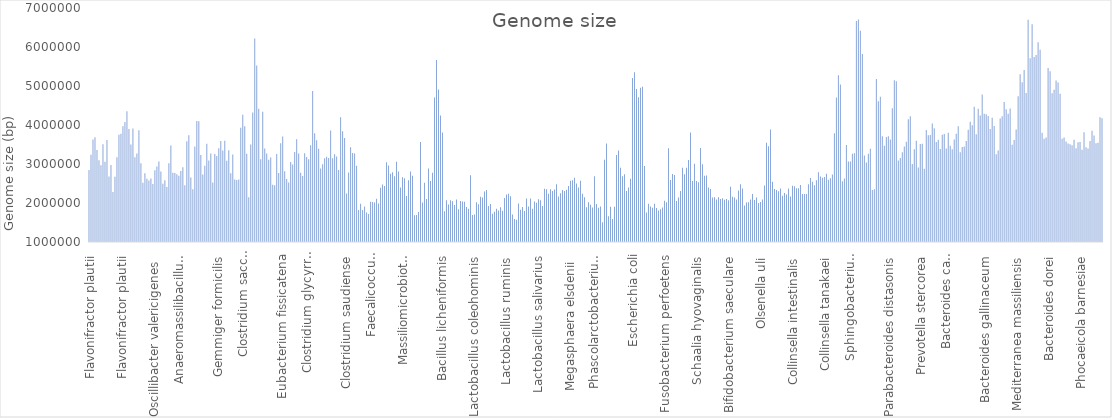
| Category | Series 0 |
|---|---|
| Flavonifractor plautii | 2845789 |
| Flavonifractor plautii | 3239670 |
| Flavonifractor plautii | 3629120 |
| Flavonifractor plautii | 3683590 |
| Flavonifractor plautii | 3357728 |
| Flavonifractor plautii  | 3098980 |
| Flavonifractor plautii | 2967986 |
| Pseudoflavonifractor phocaeensis | 3503425 |
| Flavonifractor plautii | 3054748 |
| Pseudoflavonifractor capillosus | 3617258 |
| Pseudoflavonifractor phocaeensis | 2678620 |
| Pseudoflavonifractor phocaeensis | 2973216 |
| Pseudoflavonifractor phocaeensis | 2283035 |
| Pseudoflavonifractor phocaeensis  | 2671950 |
| Flavonifractor plautii | 3170217 |
| Flavonifractor plautii  | 3751524 |
| Flavonifractor plautii | 3776725 |
| Flavonifractor plautii | 3967264 |
| Pseudoflavonifractor phocaeensis  | 4079298 |
| Pseudoflavonifractor phocaeensis | 4349976 |
| Intestinimonas butyriciproducens | 3896645 |
| Flavonifractor plautii | 3498453 |
| Flavonifractor plautii | 3907586 |
| Pseudoflavonifractor phocaeensis | 3173634 |
| Pseudoflavonifractor phocaeensis | 3272401 |
| Flavonifractor plautii | 3867419 |
| Pseudoflavonifractor capillosus | 3018026 |
| Pseudoflavonifractor capillosus | 2519586 |
| Pseudoflavonifractor capillosus | 2764660 |
| Pseudoflavonifractor capillosus | 2623188 |
| Pseudoflavonifractor capillosus | 2574287 |
| Pseudoflavonifractor capillosus  | 2627565 |
| Oscillibacter valericigenes  | 2487084 |
| Oscillibacter valericigenes | 2841521 |
| Oscillibacter valericigenes | 2936113 |
| Oscillibacter ruminantium | 3063487 |
| Oscillibacter valericigenes  | 2807727 |
| Oscillibacter valericigenes | 2493680 |
| Intestinimonas butyriciproducens | 2584430 |
| Butyricicoccus pullicaecorum | 2408243 |
| Butyricicoccus pullicaecorum | 3016034 |
| Butyricicoccus pullicaecorum | 3474625 |
| Agathobaculum desmolans | 2773809 |
| Agathobaculum desmolans | 2771997 |
| Butyricicoccus pullicaecorum | 2738173 |
| Butyricicoccus pullicaecorum | 2697586 |
| Anaeromassilibacillus senegalensis | 2820032 |
| Neglecta timonensis | 2916119 |
| Anaeromassilibacillus senegalensis  | 2453749 |
| Anaeromassilibacillus senegalensis | 3582839 |
| Anaeromassilibacillus senegalensis | 3738663 |
| Phocea massiliensis | 2650686 |
| Hydrogenoanaerobacterium saccharovorans | 2349402 |
| Anaerotruncus colihominis | 3446606 |
| Anaerotruncus colihominis | 4104028 |
| Anaerotruncus colihominis | 4098164 |
| Anaerofilum agile | 3232216 |
| Faecalibacterium prausnitzii | 2728163 |
| Faecalibacterium prausnitzii | 2956350 |
| Faecalibacterium prausnitzii | 3520066 |
| Faecalibacterium prausnitzii | 3092450 |
| Faecalibacterium prausnitzii | 3272200 |
| Fournierella massiliensis | 2528274 |
| Gemmiger formicilis | 3259334 |
| Gemmiger formicilis | 3203791 |
| Gemmiger formicilis | 3406814 |
| Gorbachella massiliensis | 3586714 |
| Fournierella massiliensis | 3347135 |
| Gemmiger formicilis | 3597344 |
| Gemmiger formicilis | 3080663 |
| Gemmiger formicilis | 3355244 |
| Clostridium lactatifermentans | 2765027 |
| Clostridium lactatifermentans | 3241294 |
| Anaerotignum lactatifermentans | 2605006 |
| Anaerotignum lactatifermentans | 2591845 |
| Anaerotignum lactatifermentans | 2599663 |
| Eubacterium hallii | 3929296 |
| Eubacterium hallii | 4260545 |
| Blautia schinkii | 3969115 |
| Clostridium saccharolyticum | 3261385 |
| Clostridium saccharolyticum  | 2149297 |
| Clostridium saccharolyticum | 3501825 |
| Clostridium saccharolyticum | 4319160 |
| Clostridium aldenense | 6217358 |
| Clostridium clostridioforme | 5528407 |
| Clostridium bolteae | 4415165 |
| Roseburia hominis | 3121960 |
| Blautia producta | 4340741 |
| Clostridium saccharolyticum | 3396328 |
| Clostridium saccharolyticum | 3268479 |
| Blautia producta  | 3110659 |
| Ruminococcus gnavus | 3169709 |
| Eubacterium contortum | 2469525 |
| Eubacterium contortum  | 2453398 |
| Eubacterium contortum | 3256976 |
| Eubacterium contortum | 2766308 |
| Eubacterium fissicatena | 3529099 |
| Eubacterium fissicatena | 3702317 |
| Mordavella massiliensis | 2813570 |
| Mordavella massiliensis | 2614310 |
| Mordavella massiliensis | 2522524 |
| Drancourtella massiliensis | 3049918 |
| Drancourtella massiliensis | 2986142 |
| Drancourtella massiliensis | 3307621 |
| Drancourtella massiliensis | 3637323 |
| Drancourtella massiliensis  | 3268163 |
| Clostridium oroticum | 2778317 |
| Lachnoclostridium phocaeense | 2689208 |
| Eubacterium contortum | 3274758 |
| Faecalicatena contorta | 3177825 |
| Faecalicatena fissicatena | 3120786 |
| Eubacterium contortum | 3480620 |
| Clostridium glycyrrhizinilyticum | 4874615 |
| Mediterraneibacter massiliensis | 3787014 |
| Clostridium glycyrrhizinilyticum  | 3611738 |
| Clostridium glycyrrhizinilyticum | 3392322 |
| Faecalicatena orotica | 2881418 |
| Ruminococcus torques | 2991956 |
| Clostridium glycyrrhizinilyticum | 3146015 |
| Clostridium glycyrrhizinilyticum | 3184216 |
| Clostridium glycyrrhizinilyticum | 3150868 |
| Clostridium glycyrrhizinilyticum | 3861943 |
| Clostridium glycyrrhizinilyticum | 3144994 |
| Clostridium glycyrrhizinilyticum | 3249393 |
| Clostridium glycyrrhizinilyticum | 3190622 |
| Paraclostridium benzoelyticum | 2842993 |
| Clostridioides difficile | 4201736 |
| Clostridium sporogenes | 3839155 |
| Clostridium saudiense | 3669195 |
| Clostridium saudiense | 2243750 |
| Clostridium saudiense | 2782383 |
| Clostridium perfringens | 3427432 |
| Clostridium perfringens | 3279733 |
| Clostridium perfringens | 3267175 |
| Absiella dolichum | 2955382 |
| Eubacterium cylindroides | 1822768 |
| Eubacterium cylindroides | 1979688 |
| Eubacterium cylindroides  | 1822962 |
| Eubacterium cylindroides  | 1910879 |
| Faecalicoccus acidiformans | 1753517 |
| Faecalicoccus acidiformans | 1718428 |
| Faecalicoccus pleomorphus | 2034983 |
| Faecalicoccus pleomorphus | 2028421 |
| Streptococcus pleomorphus  | 2015224 |
| Faecalicoccus pleomorphus  | 2108416 |
| Streptococcus pleomorphus  | 1989143 |
| Faecalibacillus faecis | 2390200 |
| Faecalibacillus faecis | 2476710 |
| Faecalibacillus faecis | 2435231 |
| Clostridium spiroforme | 3043058 |
| Clostridium spiroforme | 2963161 |
| Clostridium spiroforme | 2749214 |
| Clostridium spiroforme | 2786011 |
| Clostridium spiroforme | 2686825 |
| Coprobacillus cateniformis  | 3055469 |
| Massiliomicrobiota timonensis | 2808053 |
| Massiliomicrobiota timonensis  | 2395512 |
| Massiliomicrobiota timonensis | 2657304 |
| Massiliomicrobiota timonensis | 2632118 |
| Massiliomicrobiota timonensis | 2177649 |
| Massiliomicrobiota timonensis | 2583105 |
| Massiliomicrobiota timonensis | 2805108 |
| Streptococcus pasteurianus | 2699370 |
| Streptococcus alactolyticus | 1686582 |
| Streptococcus alactolyticus  | 1690609 |
| Streptococcus alactolyticus | 1766300 |
| Enterococcus gallinarum  | 3562529 |
| Enterococcus cecorum | 2010800 |
| Enterococcus cecorum | 2521030 |
| Enterococcus cecorum | 2100522 |
| Enterococcus cecorum | 2884612 |
| Staphylococcus saprophyticus | 2563464 |
| Staphylococcus saprophyticus | 2777765 |
| Oceanobacillus oncorhynchi | 4702048 |
| Bacillus cereus  | 5667840 |
| Bacillus circulans  | 4912760 |
| Bacillus licheniformis | 4243165 |
| Bacillus stratosphericus | 3807391 |
| Lactobacillus gasseri | 1786561 |
| Lactobacillus crispatus  | 2072894 |
| Lactobacillus crispatus | 1959204 |
| Lactobacillus gallinarum | 2068702 |
| Lactobacillus gallinarum | 2042196 |
| Lactobacillus gallinarum | 1949126 |
| Lactobacillus gallinarum | 2087134 |
| Lactobacillus gallinarum | 1837937 |
| Lactobacillus gallinarum | 2051080 |
| Lactobacillus gallinarum | 2039377 |
| Weissella paramesenteroides | 2031927 |
| Pediococcus pentosaceus | 1898810 |
| Weissella jogaejeotgali | 1855337 |
| Pediococcus acidilactici | 2711938 |
| Lactobacillus coleohominis | 1690277 |
| Lactobacillus coleohominis | 1703045 |
| Lactobacillus ingluviei | 2021907 |
| Lactobacillus alvi  | 1965443 |
| Lactobacillus coleohominis | 2162079 |
| Lactobacillus reuteri  | 2141154 |
| Lactobacillus reuteri | 2293009 |
| Lactobacillus reuteri | 2330171 |
| Lactobacillus panis | 1920695 |
| Lactobacillus pontis | 1974659 |
| Lactobacillus vaginalis | 1726144 |
| Lactobacillus vaginalis | 1776899 |
| Lactobacillus vaginalis | 1849593 |
| Lactobacillus vaginalis | 1809199 |
| Lactobacillus vaginalis | 1887857 |
| Lactobacillus vaginalis | 1804443 |
| Lactobacillus ruminis  | 2131044 |
| Lactobacillus agilis  | 2217928 |
| Lactobacillus agilis | 2236004 |
| Lactobacillus agilis  | 2173607 |
| Lactobacillus aviarius | 1705133 |
| Lactobacillus aviarius | 1591811 |
| Lactobacillus aviarius | 1568900 |
| Lactobacillus salivarius | 1989106 |
| Lactobacillus salivarius | 1826390 |
| Lactobacillus salivarius | 1900005 |
| Ligilactobacillus salivarius | 1796716 |
| Lactobacillus salivarius | 2115320 |
| Lactobacillus salivarius  | 1910606 |
| Lactobacillus salivarius  | 2115517 |
| Lactobacillus salivarius | 1854333 |
| Lactobacillus salivarius | 2039311 |
| Lactobacillus salivarius | 2005434 |
| Lactobacillus salivarius | 2098236 |
| Lactobacillus salivarius  | 2068299 |
| Lactobacillus salivarius | 1920338 |
| Mitsuokella multacida | 2362484 |
| Anaerovibrio lipolyticus | 2355360 |
| Megamonas funiformis  | 2238742 |
| Megamonas rupellensis | 2349781 |
| Megamonas funiformis  | 2306494 |
| Megamonas hypermegale | 2343299 |
| Megamonas hypermegale | 2483686 |
| Megamonas hypermegale | 2165576 |
| Megamonas hypermegale | 2247683 |
| Megamonas hypermegale  | 2334718 |
| Veillonella magna | 2306416 |
| Veillonella magna | 2341844 |
| Megasphaera elsdenii  | 2432813 |
| Megasphaera elsdenii | 2571937 |
| Megasphaera hexanoica | 2586416 |
| Megasphaera stantonii | 2646501 |
| Megasphaera stantonii | 2497190 |
| Megasphaera elsdenii | 2396433 |
| Megasphaera elsdenii  | 2569058 |
| Phascolarctobacterium succinatutens | 2235269 |
| Phascolarctobacterium succinatutens | 2147502 |
| Phascolarctobacterium faecium | 1890772 |
| Phascolarctobacterium faecium | 2016670 |
| Phascolarctobacterium faecium | 1954922 |
| Phascolarctobacterium faecium | 1885819 |
| Phascolarctobacterium faecium | 2685527 |
| Phascolarctobacterium faecium | 1975198 |
| Phascolarctobacterium faecium | 1876462 |
| Phascolarctobacterium faecium | 1907904 |
| Elusimicrobium minutum | 1505722 |
| Brevundimonas olei | 3110009 |
| Brevundimonas diminuta | 3522810 |
| Campylobacter jejuni | 1660525 |
| Helicobacter pullorum | 1906561 |
| Helicobacter pullorum | 1589699 |
| Helicobacter pullorum | 1905124 |
| Desulfovibrio desulfuricans | 3230576 |
| Desulfovibrio desulfuricans | 3347009 |
| Desulfovibrio piger | 2906281 |
| Desulfovibrio piger | 2686489 |
| Desulfovibrio piger | 2738806 |
| Succinatimonas hippei | 2308122 |
| Succinatimonas hippei | 2397496 |
| Gallibacterium anatis | 2621309 |
| Escherichia coli | 5207751 |
| Escherichia coli | 5352565 |
| Escherichia coli | 4922971 |
| Salmonella Enteritidis | 4712250 |
| Salmonella Typhimurium | 4953121 |
| Salmonella Typhimurium | 4982964 |
| Sutterella massiliensis  | 2951411 |
| Parasutterella secunda | 1758756 |
| Parasutterella secunda | 1979860 |
| Parasutterella secunda | 1908660 |
| Parasutterella secunda | 1880404 |
| Parasutterella secunda | 1980804 |
| Parasutterella secunda | 1873731 |
| Parasutterella secunda | 1805436 |
| Parasutterella secunda | 1839749 |
| Parasutterella secunda | 1887086 |
| Fusobacterium perfoetens | 2056256 |
| Fusobacterium perfoetens | 2020718 |
| Fusobacterium varium | 3401501 |
| Fusobacterium varium  | 2589974 |
| Fusobacterium mortiferum | 2741665 |
| Fusobacterium mortiferum  | 2720398 |
| Fusobacterium mortiferum  | 2052313 |
| Fusobacterium mortiferum | 2138530 |
| Fusobacterium mortiferum | 2306985 |
| Cloacibacillus porcorum | 2902045 |
| Akkermansia muciniphila | 2734062 |
| Brachyspira innocens | 2901368 |
| Brachyspira innocens | 3101555 |
| Cellulomonas cellasea | 3808612 |
| Arcanobacterium haemolyticum | 2565221 |
| Actinomyces viscosus | 3007556 |
| Schaalia hyovaginalis | 2565164 |
| Cutibacterium acnes | 2533567 |
| Corynebacterium glutamicum | 3411844 |
| Corynebacterium variabile | 2995603 |
| Corynebacterium stationis | 2696982 |
| Corynebacterium stationis | 2702516 |
| Bifidobacterium stercoris | 2399752 |
| Bifidobacterium saeculare | 2360750 |
| Bifidobacterium boum | 2143314 |
| Bifidobacterium porcinum | 2147767 |
| Bifidobacterium thermophilum | 2091762 |
| Bifidobacterium porcinum | 2148869 |
| Bifidobacterium saeculare | 2101890 |
| Bifidobacterium saeculare | 2122046 |
| Bifidobacterium saeculare | 2082572 |
| Bifidobacterium saeculare | 2100654 |
| Bifidobacterium saeculare | 2068307 |
| Olsenella uli | 2413556 |
| Olsenella uli | 2158343 |
| Olsenella uli | 2138506 |
| Olsenella uli | 2090735 |
| Olsenella uli | 2318914 |
| Olsenella uli | 2477652 |
| Olsenella uli | 2374513 |
| Olsenella uli | 1934591 |
| Olsenella uli | 2014154 |
| Olsenella uli | 2017774 |
| Olsenella uli | 2087302 |
| Olsenella uli | 2232826 |
| Olsenella profusa | 2074385 |
| Olsenella uli | 2139226 |
| Olsenella uli | 1996846 |
| Olsenella uli | 2023386 |
| Olsenella uli | 2087038 |
| Slackia piriformis | 2449688 |
| Gordonibacter urolithinfaciens | 3542488 |
| Gordonibacter urolithinfaciens | 3457314 |
| Gordonibacter urolithinfaciens | 3885330 |
| Collinsella tanakaei | 2542639 |
| Enorma phocaeensis | 2361676 |
| Enorma phocaeensis | 2333660 |
| Enorma timonensis | 2299978 |
| Enorma massiliensis | 2374054 |
| Enorma massiliensis | 2188939 |
| Enorma massiliensis | 2259151 |
| Collinsella intestinalis | 2218890 |
| Collinsella intestinalis | 2368937 |
| Collinsella intestinalis | 2167489 |
| Collinsella intestinalis | 2439574 |
| Collinsella intestinalis | 2432383 |
| Collinsella intestinalis | 2379069 |
| Collinsella intestinalis | 2375164 |
| Collinsella tanakaei | 2458847 |
| Collinsella tanakaei | 2231515 |
| Collinsella tanakaei | 2231943 |
| Collinsella tanakaei | 2231439 |
| Collinsella tanakaei | 2482869 |
| Collinsella tanakaei | 2644183 |
| Collinsella tanakaei | 2547738 |
| Collinsella tanakaei | 2454813 |
| Collinsella tanakaei | 2585657 |
| Collinsella tanakaei | 2790023 |
| Collinsella tanakaei | 2682023 |
| Collinsella tanakaei | 2648091 |
| Collinsella tanakaei | 2666398 |
| Collinsella tanakaei | 2752014 |
| Collinsella tanakaei | 2595922 |
| Collinsella tanakaei | 2631819 |
| Collinsella tanakaei | 2727846 |
| Empedobacter brevis | 3787563 |
| Chryseobacterium formosense | 4702747 |
| Chryseobacterium indologenes | 5273946 |
| Chryseobacterium indologenes | 5040248 |
| Alistipes senegalensis | 2560539 |
| Alistipes senegalensis | 2626508 |
| Alistipes onderdonkii | 3488443 |
| Alistipes senegalensis | 3064564 |
| Alistipes senegalensis | 3065798 |
| Alistipes senegalensis | 3264205 |
| Alistipes shahii | 3272633 |
| Sphingobacterium multivorum | 6667084 |
| Sphingobacterium multivorum | 6703363 |
| Sphingobacterium siyangense | 6416673 |
| Sphingobacterium multivorum | 5822360 |
| Barnesiella viscericola | 3220804 |
| Barnesiella viscericola | 3040531 |
| Barnesiella viscericola | 3264150 |
| Barnesiella viscericola | 3388394 |
| Muribaculum intestinale | 2336263 |
| Muribaculum intestinale | 2349712 |
| Butyricimonas paravirosa | 5176855 |
| Odoribacter splanchnicus | 4610398 |
| Odoribacter splanchnicus | 4722515 |
| Parabacteroides merdae | 3709857 |
| Parabacteroides distasonis | 3466950 |
| Parabacteroides distasonis | 3695460 |
| Parabacteroides distasonis | 3714601 |
| Parabacteroides distasonis | 3629896 |
| Parabacteroides johnsonii | 4430164 |
| Parabacteroides distasonis | 5145110 |
| Parabacteroides distasonis | 5123309 |
| Prevotella brevis | 3091971 |
| Prevotella brevis | 3153520 |
| Prevotella loescheii | 3302816 |
| Prevotella shahii | 3447026 |
| Marseilla massiliensis | 3570489 |
| Marseilla massiliensis | 4148582 |
| Marseilla massiliensis | 4224847 |
| Prevotella dentalis | 2997648 |
| Prevotella copri | 3375827 |
| Prevotella copri | 3598870 |
| Prevotella stercorea | 2912128 |
| Prevotella stercorea | 3515594 |
| Prevotella stercorea | 3519389 |
| Prevotellamassilia timonensis | 2881035 |
| Bacteroides gallinaceum | 3868919 |
| Bacteroides gallinaceum | 3740235 |
| Bacteroides gallinaceum | 3743539 |
| Bacteroides caecigallinarum | 4041510 |
| Bacteroides caecigallinarum | 3919301 |
| Bacteroides caecigallinarum | 3561783 |
| Bacteroides caecigallinarum | 3623492 |
| Bacteroides caecigallinarum | 3381641 |
| Bacteroides caecigallinarum | 3751577 |
| Bacteroides caecigallinarum | 3766773 |
| Bacteroides caecigallinarum | 3396164 |
| Bacteroides caecigallinarum | 3802946 |
| Bacteroides caecigallinarum | 3470734 |
| Bacteroides caecigallinarum | 3378958 |
| Bacteroides helcogenes | 3628556 |
| Paraphocaeicola brunensis | 3778239 |
| Mediterranea massiliensis | 3968548 |
| Bacteroides caecicola | 3300198 |
| Bacteroides caecicola | 3437559 |
| Bacteroides salanitronis | 3449415 |
| Bacteroides salanitronis | 3590521 |
| Bacteroides caecicola | 3881205 |
| Bacteroides gallinaceum | 4086481 |
| Bacteroides gallinaceum | 3992910 |
| Bacteroides gallinaceum | 4466522 |
| Bacteroides gallinaceum | 3765134 |
| Bacteroides gallinaceum | 4415476 |
| Bacteroides gallinaceum | 4244722 |
| Bacteroides gallinaceum | 4779606 |
| Bacteroides gallinaceum | 4288778 |
| Bacteroides gallinaceum | 4274219 |
| Bacteroides gallinaceum | 4227987 |
| Bacteroides gallinaceum | 3897793 |
| Bacteroides gallinaceum | 4182994 |
| Bacteroides gallinaceum | 3976735 |
| Bacteroides eggerthii | 3248977 |
| Bacteroides pyogenes | 3343034 |
| Bacteroides clarus | 4166078 |
| Bacteroides clarus | 4226284 |
| Bacteroides uniformis | 4590834 |
| Bacteroides uniformis | 4405987 |
| Mediterranea massiliensis | 4289797 |
| Bacteroides rodentium | 4420777 |
| Mediterranea massiliensis | 3495770 |
| Mediterranea massiliensis | 3614387 |
| Mediterranea massiliensis | 3881690 |
| Bacteroides fragilis | 4740364 |
| Bacteroides fragilis | 5303476 |
| Bacteroides fragilis | 5097252 |
| Bacteroides fragilis | 5412109 |
| Bacteroides caccae | 4821094 |
| Bacteroides ovatus | 6700861 |
| Bacteroides xylanisolvens | 5713108 |
| Bacteroides xylanisolvens | 6581102 |
| Bacteroides xylanisolvens | 5745201 |
| Bacteroides thetaiotaomicron | 5794003 |
| Bacteroides thetaiotaomicron | 6124892 |
| Bacteroides thetaiotaomicron | 5928906 |
| Bacteroides coprophilus | 3800412 |
| Mediterranea massiliensis | 3650403 |
| Bacteroides coprophilus | 3679794 |
| Bacteroides dorei | 5463463 |
| Bacteroides dorei | 5376103 |
| Bacteroides vulgatus | 4812359 |
| Bacteroides vulgatus | 4902934 |
| Bacteroides vulgatus | 5138835 |
| Bacteroides vulgatus | 5090224 |
| Bacteroides vulgatus | 4799023 |
| Bacteroides coprophilus | 3645090 |
| Bacteroides barnesiae | 3679827 |
| Bacteroides barnesiae | 3578819 |
| Bacteroides barnesiae | 3527544 |
| Bacteroides barnesiae | 3503441 |
| Bacteroides barnesiae | 3479624 |
| Bacteroides barnesiae | 3623209 |
| Bacteroides barnesiae | 3406779 |
| Bacteroides barnesiae | 3559933 |
| Phocaeicola barnesiae | 3561864 |
| Bacteroides plebeius | 3368253 |
| Bacteroides plebeius | 3813090 |
| Bacteroides plebeius | 3426300 |
| Bacteroides plebeius | 3396628 |
| Bacteroides plebeius | 3590503 |
| Bacteroides coprocola | 3855141 |
| Bacteroides coprocola | 3730281 |
| Bacteroides mediterraneensis | 3531522 |
| Bacteroides mediterraneensis | 3544138 |
| Bacteroides mediterraneensis | 4196391 |
| Bacteroides mediterraneensis | 4174459 |